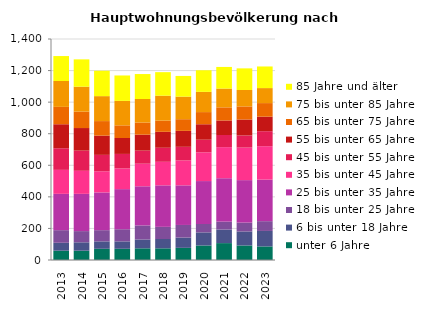
| Category | unter 6 Jahre | 6 bis unter 18 Jahre | 18 bis unter 25 Jahre | 25 bis unter 35 Jahre | 35 bis unter 45 Jahre | 45 bis unter 55 Jahre | 55 bis unter 65 Jahre | 65 bis unter 75 Jahre | 75 bis unter 85 Jahre | 85 Jahre und älter |
|---|---|---|---|---|---|---|---|---|---|---|
| 2013.0 | 59 | 50 | 80 | 230 | 152 | 137 | 152 | 110 | 164 | 158 |
| 2014.0 | 59 | 53 | 71 | 236 | 146 | 128 | 143 | 104 | 158 | 173 |
| 2015.0 | 71 | 47 | 71 | 239 | 134 | 104 | 122 | 92 | 158 | 161 |
| 2016.0 | 71 | 47 | 77 | 254 | 131 | 92 | 101 | 80 | 155 | 161 |
| 2017.0 | 74 | 56 | 89 | 248 | 143 | 83 | 101 | 77 | 149 | 158 |
| 2018.0 | 74 | 59 | 77 | 263 | 149 | 89 | 101 | 71 | 158 | 149 |
| 2019.0 | 77 | 65 | 80 | 251 | 158 | 86 | 101 | 74 | 143 | 131 |
| 2020.0 | 92 | 83 | 53 | 272 | 182 | 80 | 98 | 77 | 128 | 137 |
| 2021.0 | 107 | 86 | 50 | 275 | 197 | 77 | 92 | 83 | 119 | 137 |
| 2022.0 | 92 | 89 | 56 | 269 | 206 | 77 | 101 | 83 | 104 | 137 |
| 2023.0 | 86 | 98 | 62 | 263 | 212 | 95 | 92 | 86 | 95 | 137 |